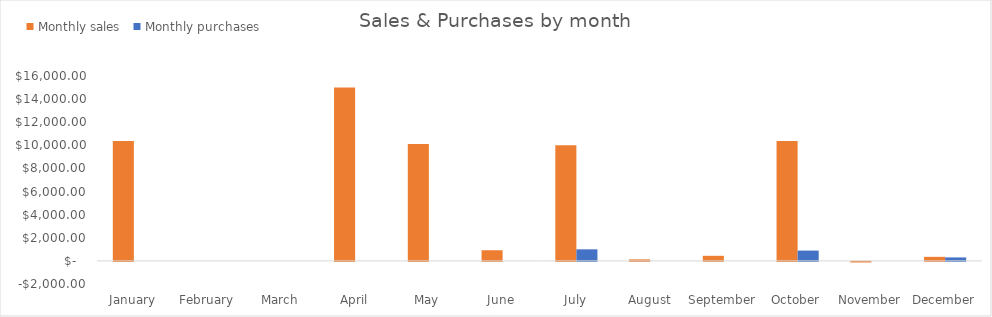
| Category |  Monthly sales  | Monthly purchases |
|---|---|---|
| January | 10375 | 0 |
| February | 0 | 0 |
| March | 0 | 0 |
| April | 15000 | 0 |
| May | 10120 | 0 |
| June | 920 | 0 |
| July | 10000 | 1000 |
| August | 130 | 0 |
| September | 440 | 0 |
| October | 10365 | 890 |
| November | -50 | 0 |
| December | 350 | 300 |